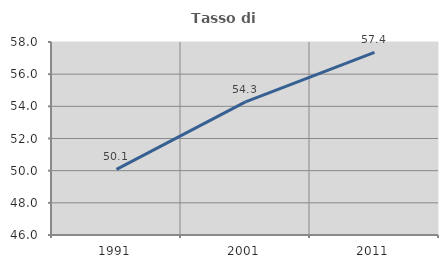
| Category | Tasso di occupazione   |
|---|---|
| 1991.0 | 50.085 |
| 2001.0 | 54.28 |
| 2011.0 | 57.354 |